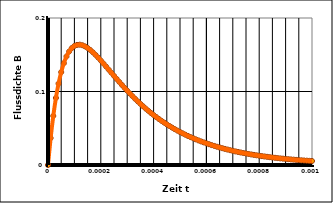
| Category | Flussdichte B [Tesla] |
|---|---|
| 0.0 | 0 |
| 1e-05 | 0.037 |
| 2e-05 | 0.067 |
| 3.0000000000000004e-05 | 0.091 |
| 4e-05 | 0.111 |
| 5e-05 | 0.126 |
| 6e-05 | 0.138 |
| 7.000000000000001e-05 | 0.148 |
| 8e-05 | 0.154 |
| 9e-05 | 0.159 |
| 0.0001 | 0.162 |
| 0.00011 | 0.163 |
| 0.00012 | 0.164 |
| 0.00013000000000000002 | 0.163 |
| 0.00014000000000000001 | 0.161 |
| 0.00015000000000000001 | 0.159 |
| 0.00016 | 0.156 |
| 0.00017 | 0.153 |
| 0.00018 | 0.15 |
| 0.00019 | 0.146 |
| 0.0002 | 0.142 |
| 0.00021 | 0.138 |
| 0.00022 | 0.134 |
| 0.00023 | 0.13 |
| 0.00024 | 0.126 |
| 0.00025 | 0.121 |
| 0.00026000000000000003 | 0.117 |
| 0.00027000000000000006 | 0.113 |
| 0.0002800000000000001 | 0.109 |
| 0.0002900000000000001 | 0.105 |
| 0.00030000000000000014 | 0.101 |
| 0.00031000000000000016 | 0.097 |
| 0.0003200000000000002 | 0.094 |
| 0.0003300000000000002 | 0.09 |
| 0.00034000000000000024 | 0.087 |
| 0.00035000000000000027 | 0.083 |
| 0.0003600000000000003 | 0.08 |
| 0.0003700000000000003 | 0.077 |
| 0.00038000000000000035 | 0.074 |
| 0.00039000000000000037 | 0.071 |
| 0.0004000000000000004 | 0.068 |
| 0.0004100000000000004 | 0.065 |
| 0.00042000000000000045 | 0.063 |
| 0.0004300000000000005 | 0.06 |
| 0.0004400000000000005 | 0.058 |
| 0.00045000000000000053 | 0.055 |
| 0.00046000000000000056 | 0.053 |
| 0.0004700000000000006 | 0.051 |
| 0.0004800000000000006 | 0.049 |
| 0.0004900000000000006 | 0.047 |
| 0.0005000000000000007 | 0.045 |
| 0.0005100000000000007 | 0.043 |
| 0.0005200000000000007 | 0.041 |
| 0.0005300000000000007 | 0.04 |
| 0.0005400000000000008 | 0.038 |
| 0.0005500000000000008 | 0.036 |
| 0.0005600000000000008 | 0.035 |
| 0.0005700000000000008 | 0.033 |
| 0.0005800000000000009 | 0.032 |
| 0.0005900000000000009 | 0.031 |
| 0.0006000000000000009 | 0.029 |
| 0.000610000000000001 | 0.028 |
| 0.000620000000000001 | 0.027 |
| 0.000630000000000001 | 0.026 |
| 0.000640000000000001 | 0.025 |
| 0.0006500000000000011 | 0.024 |
| 0.0006600000000000011 | 0.023 |
| 0.0006700000000000011 | 0.022 |
| 0.0006800000000000011 | 0.021 |
| 0.0006900000000000012 | 0.02 |
| 0.0007000000000000012 | 0.019 |
| 0.0007100000000000012 | 0.019 |
| 0.0007200000000000012 | 0.018 |
| 0.0007300000000000013 | 0.017 |
| 0.0007400000000000013 | 0.016 |
| 0.0007500000000000013 | 0.016 |
| 0.0007600000000000013 | 0.015 |
| 0.0007700000000000014 | 0.014 |
| 0.0007800000000000014 | 0.014 |
| 0.0007900000000000014 | 0.013 |
| 0.0008000000000000014 | 0.013 |
| 0.0008100000000000015 | 0.012 |
| 0.0008200000000000015 | 0.012 |
| 0.0008300000000000015 | 0.011 |
| 0.0008400000000000016 | 0.011 |
| 0.0008500000000000016 | 0.01 |
| 0.0008600000000000016 | 0.01 |
| 0.0008700000000000016 | 0.009 |
| 0.0008800000000000017 | 0.009 |
| 0.0008900000000000017 | 0.009 |
| 0.0009000000000000017 | 0.008 |
| 0.0009100000000000017 | 0.008 |
| 0.0009200000000000018 | 0.008 |
| 0.0009300000000000018 | 0.007 |
| 0.0009400000000000018 | 0.007 |
| 0.0009500000000000018 | 0.007 |
| 0.0009600000000000019 | 0.006 |
| 0.0009700000000000019 | 0.006 |
| 0.000980000000000002 | 0.006 |
| 0.000990000000000002 | 0.006 |
| 0.001000000000000002 | 0.005 |
| 0.001010000000000002 | 0.005 |
| 0.001020000000000002 | 0.005 |
| 0.001030000000000002 | 0.005 |
| 0.001040000000000002 | 0.005 |
| 0.001050000000000002 | 0.004 |
| 0.0010600000000000021 | 0.004 |
| 0.0010700000000000022 | 0.004 |
| 0.0010800000000000022 | 0.004 |
| 0.0010900000000000022 | 0.004 |
| 0.0011000000000000022 | 0.004 |
| 0.0011100000000000023 | 0.003 |
| 0.0011200000000000023 | 0.003 |
| 0.0011300000000000023 | 0.003 |
| 0.0011400000000000023 | 0.003 |
| 0.0011500000000000024 | 0.003 |
| 0.0011600000000000024 | 0.003 |
| 0.0011700000000000024 | 0.003 |
| 0.0011800000000000024 | 0.003 |
| 0.0011900000000000025 | 0.002 |
| 0.0012000000000000025 | 0.002 |
| 0.0012100000000000025 | 0.002 |
| 0.0012200000000000025 | 0.002 |
| 0.0012300000000000026 | 0.002 |
| 0.0012400000000000026 | 0.002 |
| 0.0012500000000000026 | 0.002 |
| 0.0012600000000000027 | 0.002 |
| 0.0012700000000000027 | 0.002 |
| 0.0012800000000000027 | 0.002 |
| 0.0012900000000000027 | 0.002 |
| 0.0013000000000000028 | 0.002 |
| 0.0013100000000000028 | 0.001 |
| 0.0013200000000000028 | 0.001 |
| 0.0013300000000000028 | 0.001 |
| 0.0013400000000000029 | 0.001 |
| 0.0013500000000000029 | 0.001 |
| 0.001360000000000003 | 0.001 |
| 0.001370000000000003 | 0.001 |
| 0.001380000000000003 | 0.001 |
| 0.001390000000000003 | 0.001 |
| 0.001400000000000003 | 0.001 |
| 0.001410000000000003 | 0.001 |
| 0.001420000000000003 | 0.001 |
| 0.001430000000000003 | 0.001 |
| 0.0014400000000000031 | 0.001 |
| 0.0014500000000000032 | 0.001 |
| 0.0014600000000000032 | 0.001 |
| 0.0014700000000000032 | 0.001 |
| 0.0014800000000000032 | 0.001 |
| 0.0014900000000000033 | 0.001 |
| 0.0015000000000000033 | 0.001 |
| 0.0015100000000000033 | 0.001 |
| 0.0015200000000000033 | 0.001 |
| 0.0015300000000000034 | 0.001 |
| 0.0015400000000000034 | 0.001 |
| 0.0015500000000000034 | 0.001 |
| 0.0015600000000000034 | 0.001 |
| 0.0015700000000000035 | 0 |
| 0.0015800000000000035 | 0 |
| 0.0015900000000000035 | 0 |
| 0.0016000000000000035 | 0 |
| 0.0016100000000000036 | 0 |
| 0.0016200000000000036 | 0 |
| 0.0016300000000000036 | 0 |
| 0.0016400000000000037 | 0 |
| 0.0016500000000000037 | 0 |
| 0.0016600000000000037 | 0 |
| 0.0016700000000000037 | 0 |
| 0.0016800000000000038 | 0 |
| 0.0016900000000000038 | 0 |
| 0.0017000000000000038 | 0 |
| 0.0017100000000000038 | 0 |
| 0.0017200000000000039 | 0 |
| 0.0017300000000000039 | 0 |
| 0.001740000000000004 | 0 |
| 0.001750000000000004 | 0 |
| 0.001760000000000004 | 0 |
| 0.001770000000000004 | 0 |
| 0.001780000000000004 | 0 |
| 0.001790000000000004 | 0 |
| 0.001800000000000004 | 0 |
| 0.001810000000000004 | 0 |
| 0.0018200000000000041 | 0 |
| 0.0018300000000000041 | 0 |
| 0.0018400000000000042 | 0 |
| 0.0018500000000000042 | 0 |
| 0.0018600000000000042 | 0 |
| 0.0018700000000000043 | 0 |
| 0.0018800000000000043 | 0 |
| 0.0018900000000000043 | 0 |
| 0.0019000000000000043 | 0 |
| 0.0019100000000000044 | 0 |
| 0.0019200000000000044 | 0 |
| 0.0019300000000000044 | 0 |
| 0.0019400000000000044 | 0 |
| 0.0019500000000000045 | 0 |
| 0.0019600000000000043 | 0 |
| 0.0019700000000000043 | 0 |
| 0.0019800000000000043 | 0 |
| 0.0019900000000000044 | 0 |
| 0.0020000000000000044 | 0 |
| 0.0020100000000000044 | 0 |
| 0.0020200000000000044 | 0 |
| 0.0020300000000000045 | 0 |
| 0.0020400000000000045 | 0 |
| 0.0020500000000000045 | 0 |
| 0.0020600000000000045 | 0 |
| 0.0020700000000000046 | 0 |
| 0.0020800000000000046 | 0 |
| 0.0020900000000000046 | 0 |
| 0.0021000000000000046 | 0 |
| 0.0021100000000000047 | 0 |
| 0.0021200000000000047 | 0 |
| 0.0021300000000000047 | 0 |
| 0.0021400000000000047 | 0 |
| 0.0021500000000000048 | 0 |
| 0.002160000000000005 | 0 |
| 0.002170000000000005 | 0 |
| 0.002180000000000005 | 0 |
| 0.002190000000000005 | 0 |
| 0.002200000000000005 | 0 |
| 0.002210000000000005 | 0 |
| 0.002220000000000005 | 0 |
| 0.002230000000000005 | 0 |
| 0.002240000000000005 | 0 |
| 0.002250000000000005 | 0 |
| 0.002260000000000005 | 0 |
| 0.002270000000000005 | 0 |
| 0.002280000000000005 | 0 |
| 0.002290000000000005 | 0 |
| 0.002300000000000005 | 0 |
| 0.002310000000000005 | 0 |
| 0.0023200000000000052 | 0 |
| 0.0023300000000000052 | 0 |
| 0.0023400000000000053 | 0 |
| 0.0023500000000000053 | 0 |
| 0.0023600000000000053 | 0 |
| 0.0023700000000000053 | 0 |
| 0.0023800000000000054 | 0 |
| 0.0023900000000000054 | 0 |
| 0.0024000000000000054 | 0 |
| 0.0024100000000000055 | 0 |
| 0.0024200000000000055 | 0 |
| 0.0024300000000000055 | 0 |
| 0.0024400000000000055 | 0 |
| 0.0024500000000000056 | 0 |
| 0.0024600000000000056 | 0 |
| 0.0024700000000000056 | 0 |
| 0.0024800000000000056 | 0 |
| 0.0024900000000000057 | 0 |
| 0.0025000000000000057 | 0 |
| 0.0025100000000000057 | 0 |
| 0.0025200000000000057 | 0 |
| 0.0025300000000000058 | 0 |
| 0.002540000000000006 | 0 |
| 0.002550000000000006 | 0 |
| 0.002560000000000006 | 0 |
| 0.002570000000000006 | 0 |
| 0.002580000000000006 | 0 |
| 0.002590000000000006 | 0 |
| 0.002600000000000006 | 0 |
| 0.002610000000000006 | 0 |
| 0.002620000000000006 | 0 |
| 0.002630000000000006 | 0 |
| 0.002640000000000006 | 0 |
| 0.002650000000000006 | 0 |
| 0.002660000000000006 | 0 |
| 0.002670000000000006 | 0 |
| 0.002680000000000006 | 0 |
| 0.002690000000000006 | 0 |
| 0.002700000000000006 | 0 |
| 0.0027100000000000062 | 0 |
| 0.0027200000000000063 | 0 |
| 0.0027300000000000063 | 0 |
| 0.0027400000000000063 | 0 |
| 0.0027500000000000063 | 0 |
| 0.0027600000000000064 | 0 |
| 0.0027700000000000064 | 0 |
| 0.0027800000000000064 | 0 |
| 0.0027900000000000065 | 0 |
| 0.0028000000000000065 | 0 |
| 0.0028100000000000065 | 0 |
| 0.0028200000000000065 | 0 |
| 0.0028300000000000066 | 0 |
| 0.0028400000000000066 | 0 |
| 0.0028500000000000066 | 0 |
| 0.0028600000000000066 | 0 |
| 0.0028700000000000067 | 0 |
| 0.0028800000000000067 | 0 |
| 0.0028900000000000067 | 0 |
| 0.0029000000000000067 | 0 |
| 0.0029100000000000068 | 0 |
| 0.002920000000000007 | 0 |
| 0.002930000000000007 | 0 |
| 0.002940000000000007 | 0 |
| 0.002950000000000007 | 0 |
| 0.002960000000000007 | 0 |
| 0.002970000000000007 | 0 |
| 0.002980000000000007 | 0 |
| 0.002990000000000007 | 0 |
| 0.003000000000000007 | 0 |
| 0.003010000000000007 | 0 |
| 0.003020000000000007 | 0 |
| 0.003030000000000007 | 0 |
| 0.003040000000000007 | 0 |
| 0.003050000000000007 | 0 |
| 0.003060000000000007 | 0 |
| 0.003070000000000007 | 0 |
| 0.003080000000000007 | 0 |
| 0.0030900000000000072 | 0 |
| 0.0031000000000000073 | 0 |
| 0.0031100000000000073 | 0 |
| 0.0031200000000000073 | 0 |
| 0.0031300000000000073 | 0 |
| 0.0031400000000000074 | 0 |
| 0.0031500000000000074 | 0 |
| 0.0031600000000000074 | 0 |
| 0.0031700000000000074 | 0 |
| 0.0031800000000000075 | 0 |
| 0.0031900000000000075 | 0 |
| 0.0032000000000000075 | 0 |
| 0.0032100000000000076 | 0 |
| 0.0032200000000000076 | 0 |
| 0.0032300000000000076 | 0 |
| 0.0032400000000000076 | 0 |
| 0.0032500000000000077 | 0 |
| 0.0032600000000000077 | 0 |
| 0.0032700000000000077 | 0 |
| 0.0032800000000000077 | 0 |
| 0.0032900000000000078 | 0 |
| 0.003300000000000008 | 0 |
| 0.003310000000000008 | 0 |
| 0.003320000000000008 | 0 |
| 0.003330000000000008 | 0 |
| 0.003340000000000008 | 0 |
| 0.003350000000000008 | 0 |
| 0.003360000000000008 | 0 |
| 0.003370000000000008 | 0 |
| 0.003380000000000008 | 0 |
| 0.003390000000000008 | 0 |
| 0.003400000000000008 | 0 |
| 0.003410000000000008 | 0 |
| 0.003420000000000008 | 0 |
| 0.003430000000000008 | 0 |
| 0.003440000000000008 | 0 |
| 0.003450000000000008 | 0 |
| 0.003460000000000008 | 0 |
| 0.0034700000000000082 | 0 |
| 0.0034800000000000083 | 0 |
| 0.0034900000000000083 | 0 |
| 0.0035000000000000083 | 0 |
| 0.0035100000000000083 | 0 |
| 0.0035200000000000084 | 0 |
| 0.0035300000000000084 | 0 |
| 0.0035400000000000084 | 0 |
| 0.0035500000000000084 | 0 |
| 0.0035600000000000085 | 0 |
| 0.0035700000000000085 | 0 |
| 0.0035800000000000085 | 0 |
| 0.0035900000000000085 | 0 |
| 0.0036000000000000086 | 0 |
| 0.0036100000000000086 | 0 |
| 0.0036200000000000086 | 0 |
| 0.0036300000000000087 | 0 |
| 0.0036400000000000087 | 0 |
| 0.0036500000000000087 | 0 |
| 0.0036600000000000087 | 0 |
| 0.0036700000000000088 | 0 |
| 0.003680000000000009 | 0 |
| 0.003690000000000009 | 0 |
| 0.003700000000000009 | 0 |
| 0.003710000000000009 | 0 |
| 0.003720000000000009 | 0 |
| 0.003730000000000009 | 0 |
| 0.003740000000000009 | 0 |
| 0.003750000000000009 | 0 |
| 0.003760000000000009 | 0 |
| 0.003770000000000009 | 0 |
| 0.003780000000000009 | 0 |
| 0.003790000000000009 | 0 |
| 0.003800000000000009 | 0 |
| 0.003810000000000009 | 0 |
| 0.003820000000000009 | 0 |
| 0.003830000000000009 | 0 |
| 0.003840000000000009 | 0 |
| 0.0038500000000000092 | 0 |
| 0.0038600000000000093 | 0 |
| 0.0038700000000000093 | 0 |
| 0.0038800000000000093 | 0 |
| 0.0038900000000000093 | 0 |
| 0.0039000000000000094 | 0 |
| 0.003910000000000009 | 0 |
| 0.0039200000000000085 | 0 |
| 0.003930000000000008 | 0 |
| 0.003940000000000008 | 0 |
| 0.003950000000000007 | 0 |
| 0.003960000000000007 | 0 |
| 0.0039700000000000065 | 0 |
| 0.003980000000000006 | 0 |
| 0.003990000000000006 | 0 |
| 0.004000000000000005 | 0 |
| 0.004010000000000005 | 0 |
| 0.0040200000000000045 | 0 |
| 0.004030000000000004 | 0 |
| 0.004040000000000004 | 0 |
| 0.004050000000000003 | 0 |
| 0.004060000000000003 | 0 |
| 0.0040700000000000024 | 0 |
| 0.004080000000000002 | 0 |
| 0.004090000000000002 | 0 |
| 0.004100000000000001 | 0 |
| 0.004110000000000001 | 0 |
| 0.00412 | 0 |
| 0.00413 | 0 |
| 0.00414 | 0 |
| 0.004149999999999999 | 0 |
| 0.004159999999999999 | 0 |
| 0.004169999999999998 | 0 |
| 0.004179999999999998 | 0 |
| 0.0041899999999999975 | 0 |
| 0.004199999999999997 | 0 |
| 0.004209999999999997 | 0 |
| 0.004219999999999996 | 0 |
| 0.004229999999999996 | 0 |
| 0.0042399999999999955 | 0 |
| 0.004249999999999995 | 0 |
| 0.004259999999999995 | 0 |
| 0.004269999999999994 | 0 |
| 0.004279999999999994 | 0 |
| 0.0042899999999999935 | 0 |
| 0.004299999999999993 | 0 |
| 0.004309999999999993 | 0 |
| 0.004319999999999992 | 0 |
| 0.004329999999999992 | 0 |
| 0.0043399999999999914 | 0 |
| 0.004349999999999991 | 0 |
| 0.004359999999999991 | 0 |
| 0.00436999999999999 | 0 |
| 0.00437999999999999 | 0 |
| 0.004389999999999989 | 0 |
| 0.004399999999999989 | 0 |
| 0.004409999999999989 | 0 |
| 0.004419999999999988 | 0 |
| 0.004429999999999988 | 0 |
| 0.004439999999999987 | 0 |
| 0.004449999999999987 | 0 |
| 0.0044599999999999865 | 0 |